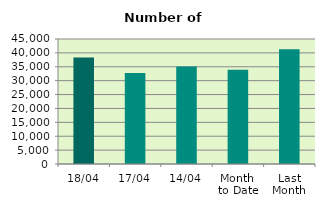
| Category | Series 0 |
|---|---|
| 18/04 | 38356 |
| 17/04 | 32730 |
| 14/04 | 35080 |
| Month 
to Date | 33908.8 |
| Last
Month | 41301.217 |